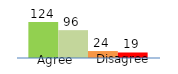
| Category | Series 0 | Series 1 | Series 2 | Series 3 |
|---|---|---|---|---|
| 0 | 124 | 96 | 24 | 19 |